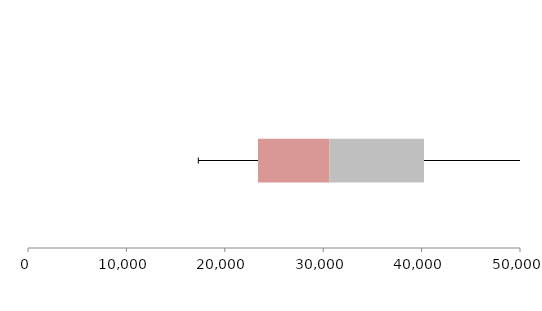
| Category | Series 1 | Series 2 | Series 3 |
|---|---|---|---|
| 0 | 23370.581 | 7279.334 | 9594.269 |